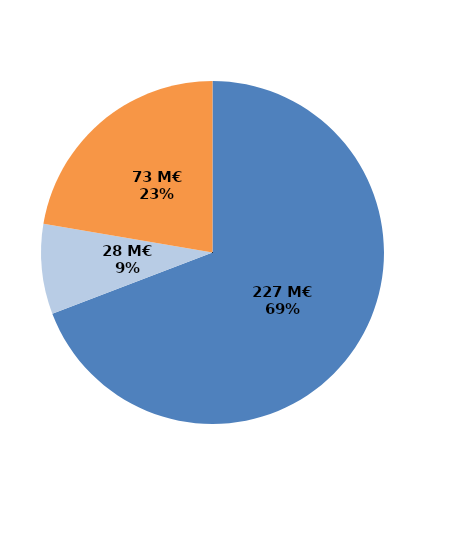
| Category | Series 0 |
|---|---|
| Formations certifiantes et pré-certifiantes | 226.656 |
| Formations professionnalisantes | 27.808 |
| Formations d'insertion sociale et professionnelle | 73.113 |